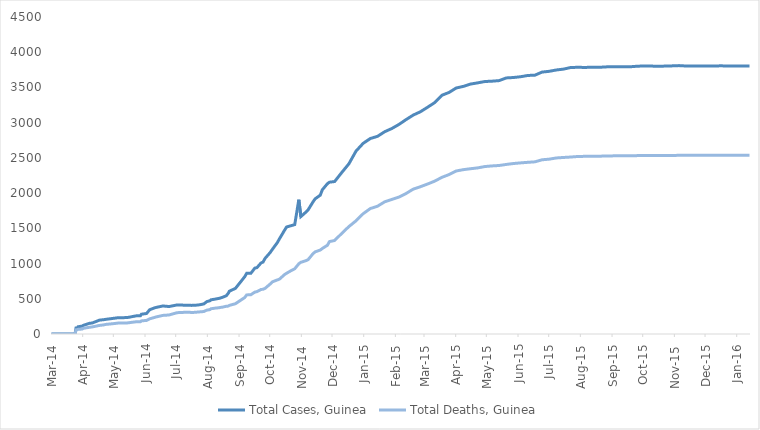
| Category | Total Cases, Guinea | Total Deaths, Guinea |
|---|---|---|
| 2014-03-01 | 0 | 0 |
| 2014-03-02 | 0 | 0 |
| 2014-03-03 | 0 | 0 |
| 2014-03-04 | 0 | 0 |
| 2014-03-05 | 0 | 0 |
| 2014-03-06 | 0 | 0 |
| 2014-03-07 | 0 | 0 |
| 2014-03-08 | 0 | 0 |
| 2014-03-09 | 0 | 0 |
| 2014-03-10 | 0 | 0 |
| 2014-03-11 | 0 | 0 |
| 2014-03-12 | 0 | 0 |
| 2014-03-13 | 0 | 0 |
| 2014-03-14 | 0 | 0 |
| 2014-03-15 | 0 | 0 |
| 2014-03-16 | 0 | 0 |
| 2014-03-17 | 0 | 0 |
| 2014-03-18 | 0 | 0 |
| 2014-03-19 | 0 | 0 |
| 2014-03-20 | 0 | 0 |
| 2014-03-21 | 0 | 0 |
| 2014-03-22 | 0 | 0 |
| 2014-03-23 | 0 | 0 |
| 2014-03-24 | 0 | 0 |
| 2014-03-25 | 86 | 59 |
| 2014-03-26 | 86 | 60 |
| 2014-03-27 | 103 | 66 |
| 2014-03-31 | 112 | 70 |
| 2014-04-01 | 122 | 80 |
| 2014-04-02 | 127 | 83 |
| 2014-04-07 | 151 | 95 |
| 2014-04-10 | 157 | 101 |
| 2014-04-17 | 197 | 122 |
| 2014-04-21 | 203 | 129 |
| 2014-04-23 | 208 | 136 |
| 2014-04-30 | 221 | 146 |
| 2014-05-05 | 231 | 155 |
| 2014-05-14 | 233 | 157 |
| 2014-05-23 | 258 | 174 |
| 2014-05-27 | 258 | 174 |
| 2014-05-28 | 281 | 186 |
| 2014-06-02 | 291 | 193 |
| 2014-06-05 | 344 | 215 |
| 2014-06-10 | 372 | 236 |
| 2014-06-11 | 376 | 241 |
| 2014-06-18 | 398 | 264 |
| 2014-06-24 | 390 | 270 |
| 2014-07-02 | 413 | 303 |
| 2014-07-07 | 412 | 305 |
| 2014-07-08 | 408 | 307 |
| 2014-07-14 | 409 | 309 |
| 2014-07-16 | 406 | 304 |
| 2014-07-21 | 410 | 310 |
| 2014-07-24 | 415 | 314 |
| 2014-07-28 | 427 | 319 |
| 2014-07-31 | 460 | 339 |
| 2014-08-03 | 472 | 346 |
| 2014-08-04 | 485 | 358 |
| 2014-08-08 | 495 | 367 |
| 2014-08-12 | 506 | 373 |
| 2014-08-13 | 510 | 377 |
| 2014-08-15 | 519 | 380 |
| 2014-08-19 | 543 | 394 |
| 2014-08-21 | 579 | 396 |
| 2014-08-22 | 607 | 406 |
| 2014-08-28 | 648 | 430 |
| 2014-09-06 | 812 | 517 |
| 2014-09-08 | 862 | 555 |
| 2014-09-12 | 861 | 557 |
| 2014-09-16 | 936 | 595 |
| 2014-09-18 | 942 | 601 |
| 2014-09-22 | 1008 | 632 |
| 2014-09-24 | 1022 | 635 |
| 2014-09-26 | 1074 | 648 |
| 2014-10-01 | 1157 | 710 |
| 2014-10-03 | 1199 | 739 |
| 2014-10-08 | 1298 | 768 |
| 2014-10-10 | 1350 | 778 |
| 2014-10-15 | 1472 | 843 |
| 2014-10-17 | 1519 | 862 |
| 2014-10-22 | 1540 | 904 |
| 2014-10-25 | 1553 | 926 |
| 2014-10-29 | 1906 | 997 |
| 2014-10-31 | 1667 | 1018 |
| 2014-11-05 | 1731 | 1041 |
| 2014-11-07 | 1760 | 1054 |
| 2014-11-12 | 1878 | 1142 |
| 2014-11-14 | 1919 | 1166 |
| 2014-11-19 | 1971 | 1192 |
| 2014-11-21 | 2047 | 1214 |
| 2014-11-26 | 2134 | 1260 |
| 2014-11-28 | 2155 | 1312 |
| 2014-12-03 | 2164 | 1327 |
| 2014-12-10 | 2292 | 1428 |
| 2014-12-17 | 2416 | 1525 |
| 2014-12-24 | 2597 | 1607 |
| 2014-12-31 | 2707 | 1708 |
| 2015-01-07 | 2775 | 1781 |
| 2015-01-14 | 2806 | 1814 |
| 2015-01-21 | 2871 | 1876 |
| 2015-01-28 | 2917 | 1910 |
| 2015-02-04 | 2975 | 1944 |
| 2015-02-11 | 3044 | 1995 |
| 2015-02-18 | 3108 | 2057 |
| 2015-02-25 | 3155 | 2091 |
| 2015-03-04 | 3219 | 2129 |
| 2015-03-11 | 3285 | 2170 |
| 2015-03-18 | 3389 | 2224 |
| 2015-03-25 | 3429 | 2263 |
| 2015-04-01 | 3492 | 2314 |
| 2015-04-08 | 3515 | 2333 |
| 2015-04-15 | 3548 | 2346 |
| 2015-04-22 | 3565 | 2358 |
| 2015-04-29 | 3584 | 2377 |
| 2015-05-06 | 3589 | 2386 |
| 2015-05-13 | 3597 | 2392 |
| 2015-05-20 | 3635 | 2407 |
| 2015-05-27 | 3641 | 2420 |
| 2015-06-03 | 3652 | 2429 |
| 2015-06-10 | 3670 | 2437 |
| 2015-06-17 | 3674 | 2444 |
| 2015-06-24 | 3718 | 2473 |
| 2015-07-01 | 3729 | 2482 |
| 2015-07-08 | 3748 | 2499 |
| 2015-07-15 | 3760 | 2506 |
| 2015-07-22 | 3783 | 2512 |
| 2015-07-29 | 3786 | 2520 |
| 2015-08-05 | 3784 | 2522 |
| 2015-08-12 | 3787 | 2524 |
| 2015-08-19 | 3786 | 2524 |
| 2015-08-26 | 3792 | 2527 |
| 2015-09-03 | 3792 | 2529 |
| 2015-09-10 | 3792 | 2530 |
| 2015-09-17 | 3792 | 2530 |
| 2015-09-24 | 3800 | 2532 |
| 2015-10-01 | 3805 | 2533 |
| 2015-10-08 | 3804 | 2534 |
| 2015-10-15 | 3800 | 2534 |
| 2015-10-22 | 3803 | 2535 |
| 2015-10-29 | 3806 | 2535 |
| 2015-11-05 | 3810 | 2536 |
| 2015-11-11 | 3805 | 2536 |
| 2015-11-18 | 3804 | 2536 |
| 2015-11-25 | 3804 | 2536 |
| 2015-12-02 | 3804 | 2536 |
| 2015-12-09 | 3804 | 2536 |
| 2015-12-16 | 3807 | 2536 |
| 2015-12-23 | 3804 | 2536 |
| 2015-12-30 | 3804 | 2536 |
| 2016-01-06 | 3804 | 2536 |
| 2016-01-13 | 3804 | 2536 |